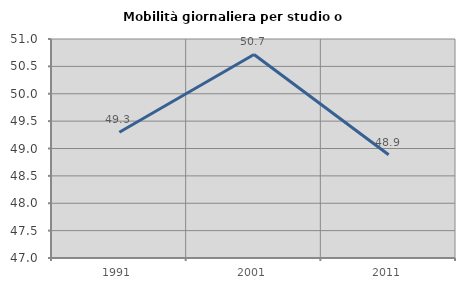
| Category | Mobilità giornaliera per studio o lavoro |
|---|---|
| 1991.0 | 49.298 |
| 2001.0 | 50.717 |
| 2011.0 | 48.887 |